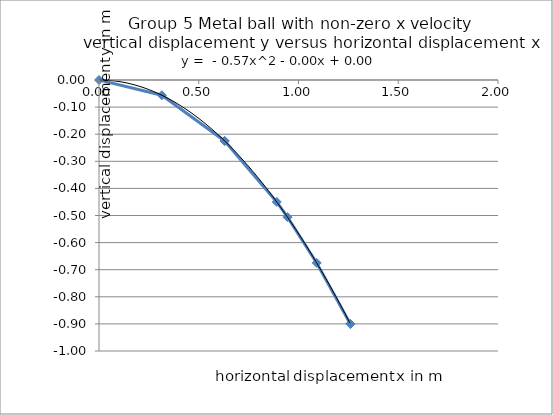
| Category | Series 0 |
|---|---|
| 0.0 | 0 |
| 0.315 | -0.056 |
| 0.63 | -0.225 |
| 0.63 | -0.225 |
| 0.8909545442950499 | -0.45 |
| 0.9450000000000001 | -0.506 |
| 1.0911920087683928 | -0.675 |
| 1.26 | -0.9 |
| 1.26 | -0.9 |